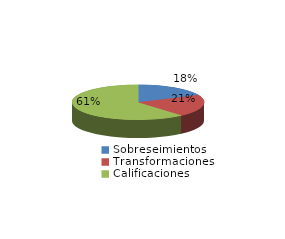
| Category | Series 0 |
|---|---|
| Sobreseimientos | 955 |
| Transformaciones | 1079 |
| Calificaciones | 3223 |